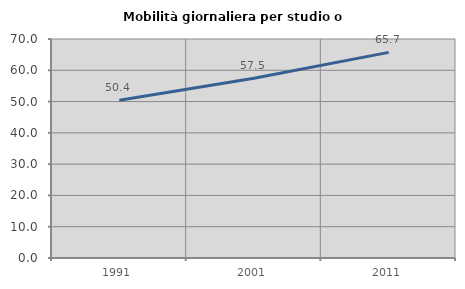
| Category | Mobilità giornaliera per studio o lavoro |
|---|---|
| 1991.0 | 50.442 |
| 2001.0 | 57.464 |
| 2011.0 | 65.725 |